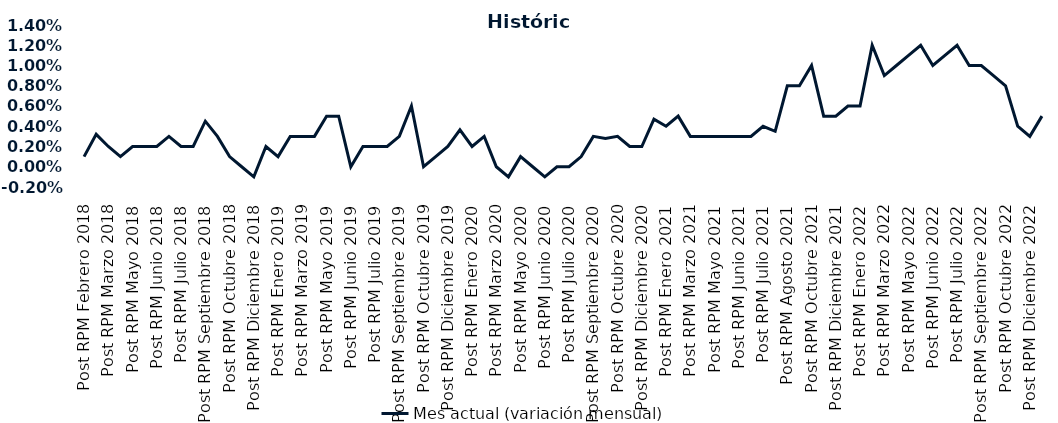
| Category | Mes actual (variación mensual)  |
|---|---|
| Post RPM Febrero 2018 | 0.001 |
| Pre RPM Marzo 2018 | 0.003 |
| Post RPM Marzo 2018 | 0.002 |
| Pre RPM Mayo 2018 | 0.001 |
| Post RPM Mayo 2018 | 0.002 |
| Pre RPM Junio 2018 | 0.002 |
| Post RPM Junio 2018 | 0.002 |
| Pre RPM Julio 2018 | 0.003 |
| Post RPM Julio 2018 | 0.002 |
| Pre RPM Septiembre 2018 | 0.002 |
| Post RPM Septiembre 2018 | 0.004 |
| Pre RPM Octubre 2018 | 0.003 |
| Post RPM Octubre 2018 | 0.001 |
| Pre RPM Diciembre 2018 | 0 |
| Post RPM Diciembre 2018 | -0.001 |
| Pre RPM Enero 2019 | 0.002 |
| Post RPM Enero 2019 | 0.001 |
| Pre RPM Marzo 2019 | 0.003 |
| Post RPM Marzo 2019 | 0.003 |
| Pre RPM Mayo 2019 | 0.003 |
| Post RPM Mayo 2019 | 0.005 |
| Pre RPM Junio 2019 | 0.005 |
| Post RPM Junio 2019 | 0 |
| Pre RPM Julio 2019 | 0.002 |
| Post RPM Julio 2019 | 0.002 |
| Pre RPM Septiembre 2019 | 0.002 |
| Post RPM Septiembre 2019 | 0.003 |
| Pre RPM Octubre 2019 | 0.006 |
| Post RPM Octubre 2019 | 0 |
| Pre RPM Diciembre 2019 | 0.001 |
| Post RPM Diciembre 2019 | 0.002 |
| Pre RPM Enero 2020 | 0.004 |
| Post RPM Enero 2020 | 0.002 |
| Pre RPM Marzo 2020 | 0.003 |
| Post RPM Marzo 2020 | 0 |
| Pre RPM Mayo 2020 | -0.001 |
| Post RPM Mayo 2020 | 0.001 |
| Pre RPM Junio 2020 | 0 |
| Post RPM Junio 2020 | -0.001 |
| Pre RPM Julio 2020 | 0 |
| Post RPM Julio 2020 | 0 |
| Pre RPM Septiembre 2020 | 0.001 |
| Post RPM Septiembre 2020 | 0.003 |
| Pre RPM Octubre 2020 | 0.003 |
| Post RPM Octubre 2020 | 0.003 |
| Pre RPM Diciembre 2020 | 0.002 |
| Post RPM Diciembre 2020 | 0.002 |
| Pre RPM Enero 2021 | 0.005 |
| Post RPM Enero 2021 | 0.004 |
| Pre RPM Marzo 2021 | 0.005 |
| Post RPM Marzo 2021 | 0.003 |
| Pre RPM Mayo 2021 | 0.003 |
| Post RPM Mayo 2021 | 0.003 |
| Pre RPM Junio 2021 | 0.003 |
| Post RPM Junio 2021 | 0.003 |
| Pre RPM Julio 2021 | 0.003 |
| Post RPM Julio 2021 | 0.004 |
| Pre RPM Agosto 2021 | 0.004 |
| Post RPM Agosto 2021 | 0.008 |
| Pre RPM Octubre 2021 | 0.008 |
| Post RPM Octubre 2021 | 0.01 |
| Pre RPM Diciembre 2021 | 0.005 |
| Post RPM Diciembre 2021 | 0.005 |
| Pre RPM Enero 2022 | 0.006 |
| Post RPM Enero 2022 | 0.006 |
| Pre RPM Marzo 2022 | 0.012 |
| Post RPM Marzo 2022 | 0.009 |
| Pre RPM Mayo 2022 | 0.01 |
| Post RPM Mayo 2022 | 0.011 |
| Pre RPM Junio 2022 | 0.012 |
| Post RPM Junio 2022 | 0.01 |
| Pre RPM Julio 2022 | 0.011 |
| Post RPM Julio 2022 | 0.012 |
| Pre RPM Septiembre 2022 | 0.01 |
| Post RPM Septiembre 2022 | 0.01 |
| Pre RPM Octubre 2022 | 0.009 |
| Post RPM Octubre 2022 | 0.008 |
| Pre RPM Diciembre 2022 | 0.004 |
| Post RPM Diciembre 2022 | 0.003 |
| Pre RPM Enero 2023 | 0.005 |